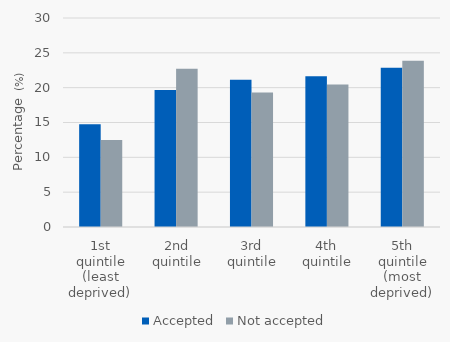
| Category | Accepted | Not accepted |
|---|---|---|
| 1st quintile (least deprived) | 14.742 | 12.5 |
| 2nd quintile | 19.656 | 22.727 |
| 3rd quintile | 21.13 | 19.318 |
| 4th quintile | 21.622 | 20.455 |
| 5th quintile (most deprived) | 22.85 | 23.864 |